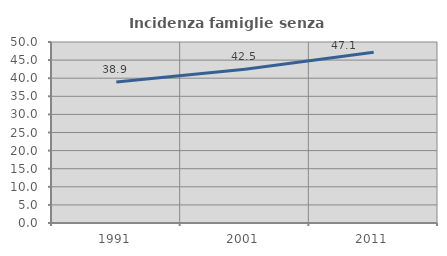
| Category | Incidenza famiglie senza nuclei |
|---|---|
| 1991.0 | 38.935 |
| 2001.0 | 42.493 |
| 2011.0 | 47.142 |